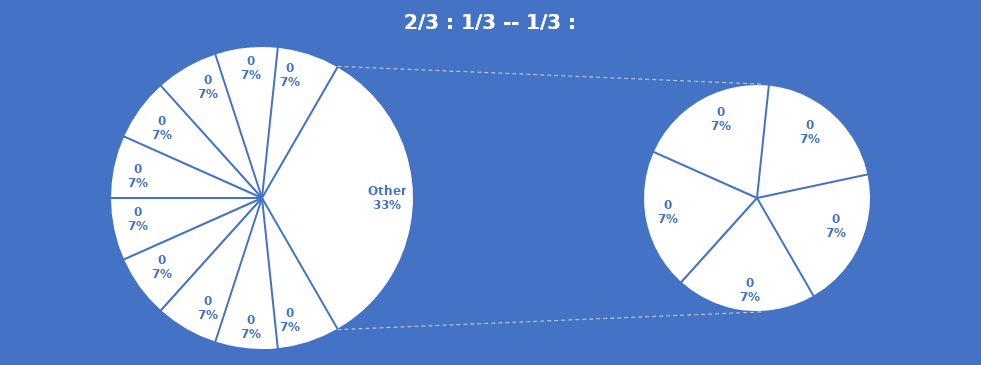
| Category | Series 0 | Series 1 |
|---|---|---|
| 0.0 | 0 | -1 |
| -1.0 | 0 | 0 |
| 0.0 | 0 | 0 |
| 0.0 | 1 | 0 |
| 0.0 | 0 | -1 |
| -1.0 | 0 | 0 |
| 0.0 | 0 | 0 |
| 0.0 | 1 | 0 |
| 0.0 | 0 | -1 |
| -1.0 | 0 | 0 |
| 0.0 | 0 | 0 |
| 0.0 | 1 | 0 |
| 0.0 | 0 | -1 |
| -1.0 | 0 | 0 |
| 0.0 | 0 | 0 |
| 0.0 | 1 | 0 |
| 0.0 | 0 | -1 |
| -1.0 | 0 | 0 |
| 0.0 | 0 | 0 |
| 0.0 | 1 | 0 |
| 0.0 | 0 | -1 |
| -1.0 | 0 | 0 |
| 0.0 | 0 | 0 |
| 0.0 | 1 | 0 |
| 0.0 | 0 | -1 |
| -1.0 | 0 | 0 |
| 0.0 | 0 | 0 |
| 0.0 | 1 | 0 |
| 0.0 | 0 | -1 |
| -1.0 | 0 | 0 |
| 0.0 | 0 | 0 |
| 0.0 | 1 | 0 |
| 0.0 | 0 | -1 |
| -1.0 | 0 | 0 |
| 0.0 | 0 | 0 |
| 0.0 | 1 | 0 |
| 0.0 | 0 | -1 |
| -1.0 | 0 | 0 |
| 0.0 | 0 | 0 |
| 0.0 | 1 | 0 |
| 0.0 | 0 | -1 |
| -1.0 | 0 | 0 |
| 0.0 | 0 | 0 |
| 0.0 | 1 | 0 |
| 0.0 | 0 | -1 |
| -1.0 | 0 | 0 |
| 0.0 | 0 | 0 |
| 0.0 | 1 | 0 |
| 0.0 | 0 | -1 |
| -1.0 | 0 | 0 |
| 0.0 | 0 | 0 |
| 0.0 | 1 | 0 |
| 0.0 | 0 | -1 |
| -1.0 | 0 | 0 |
| 0.0 | 0 | 0 |
| 0.0 | 1 | 0 |
| 0.0 | 0 | -1 |
| -1.0 | 0 | 0 |
| 0.0 | 0 | 0 |
| 0.0 | 1 | 0 |
| 0.0 | 0 | -1 |